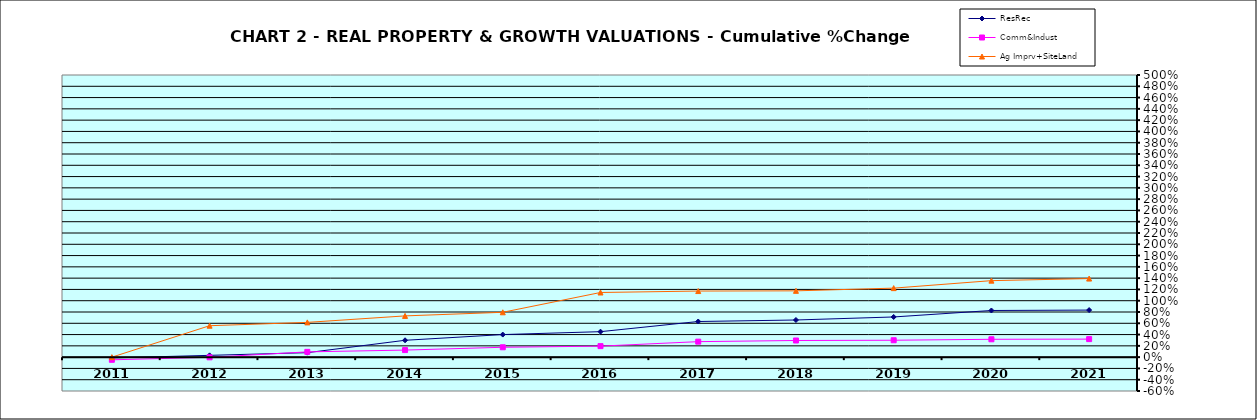
| Category | ResRec | Comm&Indust | Ag Imprv+SiteLand |
|---|---|---|---|
| 2011.0 | -0.014 | -0.047 | 0 |
| 2012.0 | 0.032 | -0.003 | 0.557 |
| 2013.0 | 0.079 | 0.093 | 0.616 |
| 2014.0 | 0.299 | 0.125 | 0.731 |
| 2015.0 | 0.4 | 0.175 | 0.795 |
| 2016.0 | 0.452 | 0.195 | 1.146 |
| 2017.0 | 0.632 | 0.275 | 1.171 |
| 2018.0 | 0.658 | 0.295 | 1.175 |
| 2019.0 | 0.712 | 0.3 | 1.223 |
| 2020.0 | 0.827 | 0.316 | 1.356 |
| 2021.0 | 0.834 | 0.32 | 1.392 |